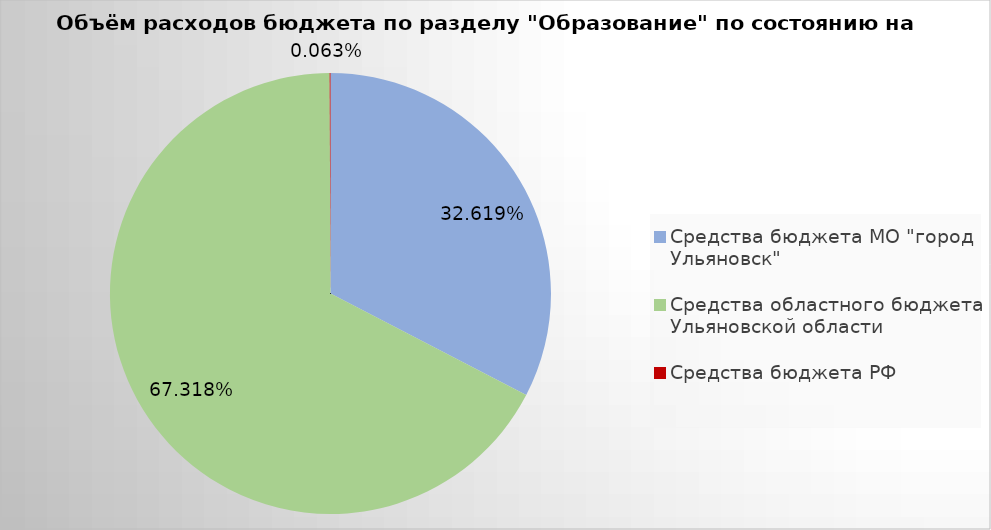
| Category | Series 0 |
|---|---|
| Средства бюджета МО "город Ульяновск" | 1687811.32 |
| Средства областного бюджета Ульяновской области | 3483295.57 |
| Средства бюджета РФ | 3283.27 |